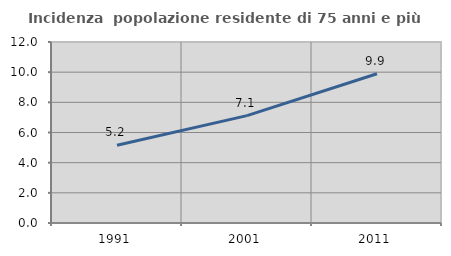
| Category | Incidenza  popolazione residente di 75 anni e più |
|---|---|
| 1991.0 | 5.155 |
| 2001.0 | 7.121 |
| 2011.0 | 9.894 |